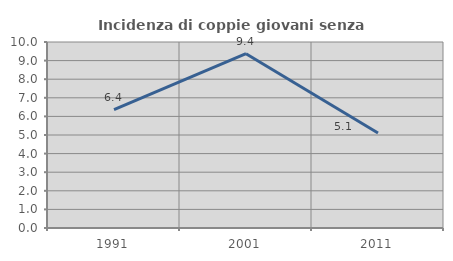
| Category | Incidenza di coppie giovani senza figli |
|---|---|
| 1991.0 | 6.37 |
| 2001.0 | 9.369 |
| 2011.0 | 5.106 |